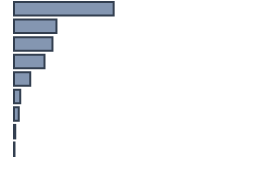
| Category | Percentatge |
|---|---|
| 0 | 41.519 |
| 1 | 17.69 |
| 2 | 16.025 |
| 3 | 12.695 |
| 4 | 6.764 |
| 5 | 2.601 |
| 6 | 1.977 |
| 7 | 0.52 |
| 8 | 0.208 |